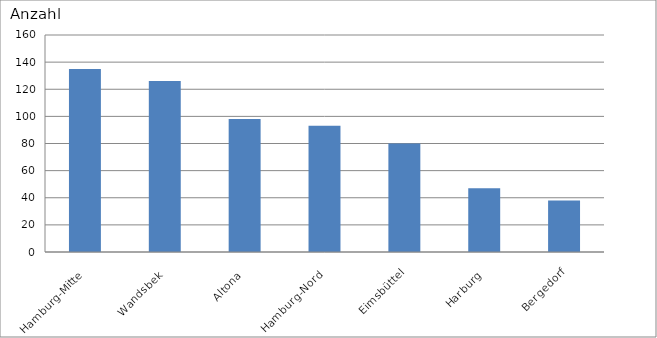
| Category | Hamburg-Mitte Wandsbek Altona Hamburg-Nord Eimsbüttel Harburg Bergedorf |
|---|---|
| Hamburg-Mitte | 135 |
| Wandsbek | 126 |
| Altona | 98 |
| Hamburg-Nord | 93 |
| Eimsbüttel | 80 |
| Harburg | 47 |
| Bergedorf | 38 |